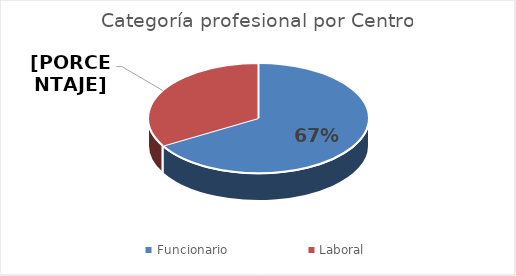
| Category | Series 0 |
|---|---|
| Funcionario | 36 |
| Laboral | 18 |